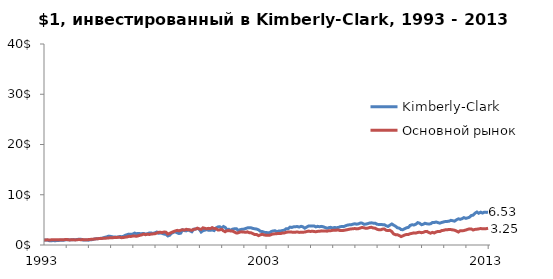
| Category | Kimberly-Clark | Основной рынок |
|---|---|---|
| 1993-01-04 | 1 | 1 |
| 1993-02-01 | 0.972 | 1.01 |
| 1993-03-01 | 0.966 | 1.029 |
| 1993-04-01 | 0.845 | 1.003 |
| 1993-05-03 | 0.842 | 1.026 |
| 1993-06-01 | 0.891 | 1.027 |
| 1993-07-01 | 0.844 | 1.021 |
| 1993-08-02 | 0.882 | 1.056 |
| 1993-09-01 | 0.899 | 1.046 |
| 1993-10-01 | 0.947 | 1.066 |
| 1993-11-01 | 0.97 | 1.052 |
| 1993-12-01 | 0.968 | 1.063 |
| 1994-01-03 | 1.062 | 1.098 |
| 1994-02-01 | 1.049 | 1.065 |
| 1994-03-01 | 1.005 | 1.016 |
| 1994-04-04 | 1.042 | 1.028 |
| 1994-05-02 | 1.073 | 1.04 |
| 1994-06-01 | 1.022 | 1.013 |
| 1994-07-01 | 1.096 | 1.044 |
| 1994-08-01 | 1.147 | 1.084 |
| 1994-09-01 | 1.153 | 1.055 |
| 1994-10-03 | 1.011 | 1.077 |
| 1994-11-01 | 0.984 | 1.034 |
| 1994-12-01 | 1.008 | 1.047 |
| 1995-01-03 | 0.963 | 1.072 |
| 1995-02-01 | 1.041 | 1.111 |
| 1995-03-01 | 1.06 | 1.141 |
| 1995-04-03 | 1.154 | 1.173 |
| 1995-05-01 | 1.223 | 1.216 |
| 1995-06-01 | 1.241 | 1.242 |
| 1995-07-03 | 1.313 | 1.281 |
| 1995-08-01 | 1.323 | 1.281 |
| 1995-09-01 | 1.411 | 1.332 |
| 1995-10-02 | 1.527 | 1.325 |
| 1995-11-01 | 1.613 | 1.38 |
| 1995-12-01 | 1.762 | 1.404 |
| 1996-01-02 | 1.716 | 1.45 |
| 1996-02-01 | 1.626 | 1.46 |
| 1996-03-01 | 1.603 | 1.471 |
| 1996-04-01 | 1.565 | 1.491 |
| 1996-05-01 | 1.57 | 1.525 |
| 1996-06-03 | 1.686 | 1.528 |
| 1996-07-01 | 1.659 | 1.458 |
| 1996-08-01 | 1.708 | 1.486 |
| 1996-09-03 | 1.947 | 1.566 |
| 1996-10-01 | 2.061 | 1.607 |
| 1996-11-01 | 2.163 | 1.725 |
| 1996-12-02 | 2.126 | 1.688 |
| 1997-01-02 | 2.176 | 1.792 |
| 1997-02-03 | 2.366 | 1.802 |
| 1997-03-03 | 2.241 | 1.726 |
| 1997-04-01 | 2.308 | 1.826 |
| 1997-05-01 | 2.264 | 1.933 |
| 1997-06-02 | 2.263 | 2.017 |
| 1997-07-01 | 2.306 | 2.175 |
| 1997-08-01 | 2.158 | 2.05 |
| 1997-09-02 | 2.249 | 2.159 |
| 1997-10-01 | 2.387 | 2.084 |
| 1997-11-03 | 2.393 | 2.177 |
| 1997-12-01 | 2.288 | 2.212 |
| 1998-01-02 | 2.422 | 2.234 |
| 1998-02-02 | 2.584 | 2.391 |
| 1998-03-02 | 2.347 | 2.511 |
| 1998-04-01 | 2.377 | 2.534 |
| 1998-05-01 | 2.321 | 2.486 |
| 1998-06-01 | 2.17 | 2.584 |
| 1998-07-01 | 2.126 | 2.554 |
| 1998-08-03 | 1.801 | 2.182 |
| 1998-09-01 | 1.942 | 2.318 |
| 1998-10-01 | 2.314 | 2.504 |
| 1998-11-02 | 2.523 | 2.652 |
| 1998-12-01 | 2.639 | 2.801 |
| 1999-01-04 | 2.412 | 2.916 |
| 1999-02-01 | 2.287 | 2.822 |
| 1999-03-01 | 2.347 | 2.932 |
| 1999-04-01 | 3.002 | 3.043 |
| 1999-05-03 | 2.867 | 2.967 |
| 1999-06-01 | 2.815 | 3.128 |
| 1999-07-01 | 3.012 | 3.028 |
| 1999-08-02 | 2.812 | 3.009 |
| 1999-09-01 | 2.63 | 2.923 |
| 1999-10-01 | 3.141 | 3.106 |
| 1999-11-01 | 3.188 | 3.165 |
| 1999-12-01 | 3.288 | 3.348 |
| 2000-01-03 | 3.122 | 3.178 |
| 2000-02-01 | 2.588 | 3.114 |
| 2000-03-01 | 2.852 | 3.415 |
| 2000-04-03 | 2.947 | 3.31 |
| 2000-05-01 | 3.077 | 3.238 |
| 2000-06-01 | 2.931 | 3.315 |
| 2000-07-03 | 2.935 | 3.261 |
| 2000-08-01 | 2.989 | 3.459 |
| 2000-09-01 | 2.865 | 3.274 |
| 2000-10-02 | 3.387 | 3.258 |
| 2000-11-01 | 3.59 | 2.997 |
| 2000-12-01 | 3.643 | 3.009 |
| 2001-01-02 | 3.337 | 3.113 |
| 2001-02-01 | 3.684 | 2.826 |
| 2001-03-01 | 3.51 | 2.644 |
| 2001-04-02 | 3.059 | 2.848 |
| 2001-05-01 | 3.128 | 2.862 |
| 2001-06-01 | 2.905 | 2.79 |
| 2001-07-02 | 3.161 | 2.76 |
| 2001-08-01 | 3.225 | 2.583 |
| 2001-09-04 | 3.237 | 2.372 |
| 2001-10-01 | 2.898 | 2.415 |
| 2001-11-01 | 3.037 | 2.597 |
| 2001-12-03 | 3.138 | 2.617 |
| 2002-01-02 | 3.164 | 2.576 |
| 2002-02-04 | 3.284 | 2.522 |
| 2002-03-01 | 3.408 | 2.615 |
| 2002-04-01 | 3.433 | 2.454 |
| 2002-05-01 | 3.422 | 2.432 |
| 2002-06-03 | 3.284 | 2.256 |
| 2002-07-01 | 3.234 | 2.078 |
| 2002-08-01 | 3.169 | 2.088 |
| 2002-09-03 | 3.015 | 1.858 |
| 2002-10-01 | 2.742 | 2.019 |
| 2002-11-01 | 2.679 | 2.134 |
| 2002-12-02 | 2.542 | 2.005 |
| 2003-01-02 | 2.48 | 1.95 |
| 2003-02-03 | 2.454 | 1.917 |
| 2003-03-03 | 2.453 | 1.933 |
| 2003-04-01 | 2.686 | 2.09 |
| 2003-05-01 | 2.802 | 2.196 |
| 2003-06-02 | 2.832 | 2.221 |
| 2003-07-01 | 2.629 | 2.257 |
| 2003-08-01 | 2.776 | 2.297 |
| 2003-09-02 | 2.806 | 2.27 |
| 2003-10-01 | 2.887 | 2.395 |
| 2003-11-03 | 2.964 | 2.412 |
| 2003-12-01 | 3.25 | 2.534 |
| 2004-01-02 | 3.248 | 2.578 |
| 2004-02-02 | 3.558 | 2.609 |
| 2004-03-01 | 3.492 | 2.567 |
| 2004-04-01 | 3.623 | 2.524 |
| 2004-05-03 | 3.647 | 2.554 |
| 2004-06-01 | 3.669 | 2.6 |
| 2004-07-01 | 3.568 | 2.511 |
| 2004-08-02 | 3.714 | 2.517 |
| 2004-09-01 | 3.618 | 2.54 |
| 2004-10-01 | 3.342 | 2.576 |
| 2004-11-01 | 3.563 | 2.675 |
| 2004-12-01 | 3.773 | 2.762 |
| 2005-01-03 | 3.756 | 2.692 |
| 2005-02-01 | 3.782 | 2.743 |
| 2005-03-01 | 3.794 | 2.691 |
| 2005-04-01 | 3.605 | 2.637 |
| 2005-05-02 | 3.713 | 2.715 |
| 2005-06-01 | 3.638 | 2.715 |
| 2005-07-01 | 3.706 | 2.813 |
| 2005-08-01 | 3.622 | 2.781 |
| 2005-09-01 | 3.485 | 2.801 |
| 2005-10-03 | 3.327 | 2.751 |
| 2005-11-01 | 3.453 | 2.848 |
| 2005-12-01 | 3.519 | 2.845 |
| 2006-01-03 | 3.369 | 2.917 |
| 2006-02-01 | 3.491 | 2.919 |
| 2006-03-01 | 3.438 | 2.951 |
| 2006-04-03 | 3.481 | 2.987 |
| 2006-05-01 | 3.609 | 2.895 |
| 2006-06-01 | 3.7 | 2.895 |
| 2006-07-03 | 3.661 | 2.91 |
| 2006-08-01 | 3.808 | 2.971 |
| 2006-09-01 | 3.95 | 3.044 |
| 2006-10-02 | 4.02 | 3.14 |
| 2006-11-01 | 4.017 | 3.192 |
| 2006-12-01 | 4.136 | 3.232 |
| 2007-01-03 | 4.224 | 3.278 |
| 2007-02-01 | 4.139 | 3.206 |
| 2007-03-01 | 4.202 | 3.238 |
| 2007-04-02 | 4.366 | 3.378 |
| 2007-05-01 | 4.354 | 3.488 |
| 2007-06-01 | 4.134 | 3.426 |
| 2007-07-02 | 4.158 | 3.317 |
| 2007-08-01 | 4.245 | 3.359 |
| 2007-09-04 | 4.376 | 3.48 |
| 2007-10-01 | 4.415 | 3.531 |
| 2007-11-01 | 4.348 | 3.376 |
| 2007-12-03 | 4.352 | 3.346 |
| 2008-01-02 | 4.119 | 3.142 |
| 2008-02-01 | 4.091 | 3.033 |
| 2008-03-03 | 4.088 | 3.014 |
| 2008-04-01 | 4.053 | 3.158 |
| 2008-05-01 | 4.041 | 3.192 |
| 2008-06-02 | 3.821 | 2.917 |
| 2008-07-01 | 3.696 | 2.888 |
| 2008-08-01 | 3.942 | 2.924 |
| 2008-09-02 | 4.183 | 2.658 |
| 2008-10-01 | 3.954 | 2.208 |
| 2008-11-03 | 3.729 | 2.043 |
| 2008-12-01 | 3.437 | 2.059 |
| 2009-01-02 | 3.354 | 1.882 |
| 2009-02-02 | 3.071 | 1.675 |
| 2009-03-02 | 3.045 | 1.818 |
| 2009-04-01 | 3.245 | 1.989 |
| 2009-05-01 | 3.427 | 2.095 |
| 2009-06-01 | 3.501 | 2.095 |
| 2009-07-01 | 3.903 | 2.251 |
| 2009-08-03 | 4.038 | 2.326 |
| 2009-09-01 | 3.979 | 2.409 |
| 2009-10-01 | 4.126 | 2.362 |
| 2009-11-02 | 4.45 | 2.497 |
| 2009-12-01 | 4.337 | 2.541 |
| 2010-01-04 | 4.043 | 2.447 |
| 2010-02-01 | 4.135 | 2.517 |
| 2010-03-01 | 4.328 | 2.665 |
| 2010-04-01 | 4.217 | 2.705 |
| 2010-05-03 | 4.178 | 2.483 |
| 2010-06-01 | 4.219 | 2.349 |
| 2010-07-01 | 4.461 | 2.511 |
| 2010-08-02 | 4.481 | 2.391 |
| 2010-09-01 | 4.572 | 2.601 |
| 2010-10-01 | 4.451 | 2.697 |
| 2010-11-01 | 4.35 | 2.691 |
| 2010-12-01 | 4.478 | 2.866 |
| 2011-01-03 | 4.598 | 2.931 |
| 2011-02-01 | 4.681 | 3.025 |
| 2011-03-01 | 4.686 | 3.022 |
| 2011-04-01 | 4.743 | 3.108 |
| 2011-05-02 | 4.904 | 3.066 |
| 2011-06-01 | 4.831 | 3.01 |
| 2011-07-01 | 4.743 | 2.945 |
| 2011-08-01 | 5.019 | 2.778 |
| 2011-09-01 | 5.207 | 2.579 |
| 2011-10-03 | 5.111 | 2.856 |
| 2011-11-01 | 5.241 | 2.842 |
| 2011-12-01 | 5.448 | 2.866 |
| 2012-01-03 | 5.3 | 2.991 |
| 2012-02-01 | 5.397 | 3.112 |
| 2012-03-01 | 5.529 | 3.21 |
| 2012-04-02 | 5.872 | 3.186 |
| 2012-05-01 | 5.937 | 2.986 |
| 2012-06-01 | 6.327 | 3.104 |
| 2012-07-02 | 6.564 | 3.144 |
| 2012-08-01 | 6.314 | 3.206 |
| 2012-09-04 | 6.537 | 3.283 |
| 2012-10-01 | 6.359 | 3.218 |
| 2012-11-01 | 6.532 | 3.228 |
| 2012-12-03 | 6.49 | 3.25 |
| 2013-01-02 | 6.503 | 3.33 |